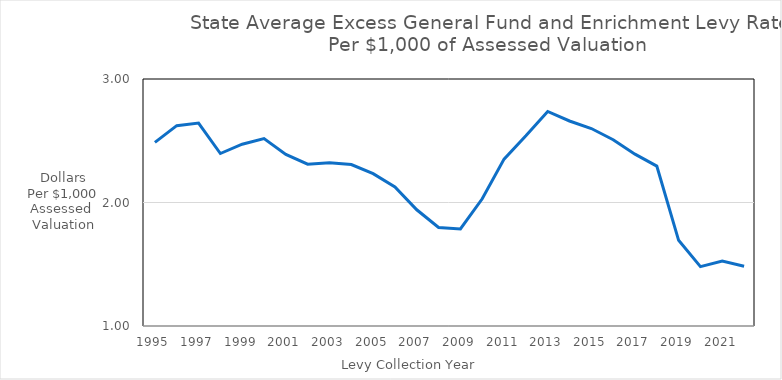
| Category | Series 0 |
|---|---|
| 1995 | 2.486 |
| 1996 | 2.622 |
| 1997 | 2.643 |
| 1998 | 2.397 |
| 1999 | 2.472 |
| 2000 | 2.518 |
| 2001 | 2.389 |
| 2002 | 2.31 |
| 2003 | 2.322 |
| 2004 | 2.308 |
| 2005 | 2.233 |
| 2006 | 2.126 |
| 2007 | 1.941 |
| 2008 | 1.797 |
| 2009 | 1.786 |
| 2010 | 2.03 |
| 2011 | 2.351 |
| 2012 | 2.54 |
| 2013 | 2.737 |
| 2014 | 2.66 |
| 2015 | 2.599 |
| 2016 | 2.508 |
| 2017 | 2.391 |
| 2018 | 2.295 |
| 2019 | 1.694 |
| 2020 | 1.481 |
| 2021 | 1.527 |
| 2022 | 1.484 |